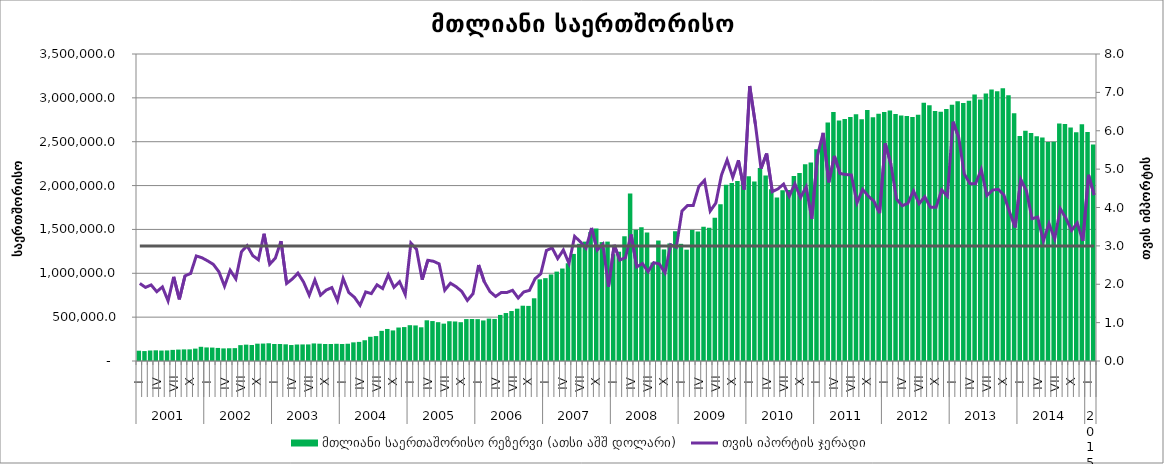
| Category | მთლიანი საერთაშორისო რეზერვი (ათსი აშშ დოლარი) |
|---|---|
| 0 | 117389.289 |
| 1 | 113225.527 |
| 2 | 119586.808 |
| 3 | 121784.336 |
| 4 | 119100.494 |
| 5 | 120539.851 |
| 6 | 126621.638 |
| 7 | 130230.06 |
| 8 | 132446.6 |
| 9 | 132843.912 |
| 10 | 141314.151 |
| 11 | 161939.3 |
| 12 | 154673.704 |
| 13 | 153155.96 |
| 14 | 148933.399 |
| 15 | 143590.72 |
| 16 | 145319.049 |
| 17 | 146717.063 |
| 18 | 180817.631 |
| 19 | 186466.393 |
| 20 | 182356.497 |
| 21 | 197532.435 |
| 22 | 198790.782 |
| 23 | 202167.392 |
| 24 | 194129.443 |
| 25 | 193695.576 |
| 26 | 190301.129 |
| 27 | 182095.356 |
| 28 | 188031.334 |
| 29 | 188868.329 |
| 30 | 189158.085 |
| 31 | 200204.792 |
| 32 | 197358.744 |
| 33 | 193613.624 |
| 34 | 194104.191 |
| 35 | 196187.768 |
| 36 | 193920.86 |
| 37 | 196811.48 |
| 38 | 212514.444 |
| 39 | 217948.403 |
| 40 | 236483.486 |
| 41 | 276240.683 |
| 42 | 284092.921 |
| 43 | 343688.446 |
| 44 | 365243.367 |
| 45 | 348545.007 |
| 46 | 381574.09 |
| 47 | 386639.086 |
| 48 | 408264.957 |
| 49 | 405450.857 |
| 50 | 384368.232 |
| 51 | 463997.258 |
| 52 | 455404.344 |
| 53 | 442635.363 |
| 54 | 426159.688 |
| 55 | 453374.04 |
| 56 | 450574.549 |
| 57 | 442442.215 |
| 58 | 477938.582 |
| 59 | 478645.824 |
| 60 | 477387.048 |
| 61 | 462352.78 |
| 62 | 483457.594 |
| 63 | 479645.109 |
| 64 | 525209.311 |
| 65 | 546894.155 |
| 66 | 569710.236 |
| 67 | 596495.846 |
| 68 | 630472.229 |
| 69 | 628326.311 |
| 70 | 715014.425 |
| 71 | 930833.393 |
| 72 | 944569.356 |
| 73 | 986716.087 |
| 74 | 1018970.638 |
| 75 | 1054278.365 |
| 76 | 1114160.468 |
| 77 | 1220729.487 |
| 78 | 1336062.499 |
| 79 | 1360970.198 |
| 80 | 1469799.647 |
| 81 | 1510431.083 |
| 82 | 1355160.588 |
| 83 | 1361139.94 |
| 84 | 1218380.992 |
| 85 | 1245880.818 |
| 86 | 1421919.99 |
| 87 | 1910253.845 |
| 88 | 1497582.718 |
| 89 | 1526134.644 |
| 90 | 1464749.428 |
| 91 | 1122855.834 |
| 92 | 1373330.153 |
| 93 | 1272102.001 |
| 94 | 1339757.483 |
| 95 | 1480157.563 |
| 96 | 1335830.434 |
| 97 | 1269325.862 |
| 98 | 1493108.058 |
| 99 | 1476027.716 |
| 100 | 1530375.506 |
| 101 | 1518203.703 |
| 102 | 1632579.525 |
| 103 | 1788341.435 |
| 104 | 2009955.589 |
| 105 | 2030508.619 |
| 106 | 2052635.598 |
| 107 | 2110413.479 |
| 108 | 2106203.981 |
| 109 | 2046269.085 |
| 110 | 2199234.144 |
| 111 | 2116174.036 |
| 112 | 1957092.26 |
| 113 | 1864408.87 |
| 114 | 1947257.286 |
| 115 | 1948646.735 |
| 116 | 2110240.516 |
| 117 | 2143452.411 |
| 118 | 2243098.08 |
| 119 | 2263931.003 |
| 120 | 2413276.234 |
| 121 | 2519379.834 |
| 122 | 2717701.26 |
| 123 | 2838315.136 |
| 124 | 2741576.745 |
| 125 | 2759253.793 |
| 126 | 2782237.942 |
| 127 | 2813452.719 |
| 128 | 2755211.768 |
| 129 | 2861887.778 |
| 130 | 2780195.98 |
| 131 | 2818259.268 |
| 132 | 2839594.988 |
| 133 | 2856750.893 |
| 134 | 2816704.829 |
| 135 | 2798459.455 |
| 136 | 2793387.554 |
| 137 | 2780985.069 |
| 138 | 2807413.792 |
| 139 | 2943749.499 |
| 140 | 2914658.817 |
| 141 | 2849332.726 |
| 142 | 2841471.603 |
| 143 | 2872974.007 |
| 144 | 2920913.483 |
| 145 | 2960164.648 |
| 146 | 2941281.374 |
| 147 | 2967640.231 |
| 148 | 3038439.423 |
| 149 | 2981696.572 |
| 150 | 3048940.273 |
| 151 | 3094880.401 |
| 152 | 3074514.403 |
| 153 | 3110052.596 |
| 154 | 3030762.59 |
| 155 | 2823422.31 |
| 156 | 2566485.807 |
| 157 | 2625815.897 |
| 158 | 2598611.489 |
| 159 | 2561530.614 |
| 160 | 2546888.469 |
| 161 | 2498141.455 |
| 162 | 2499536.21 |
| 163 | 2707900.374 |
| 164 | 2701161.577 |
| 165 | 2661929.063 |
| 166 | 2607504.967 |
| 167 | 2699187.561 |
| 168 | 2610108.469 |
| 169 | 2469434.991 |